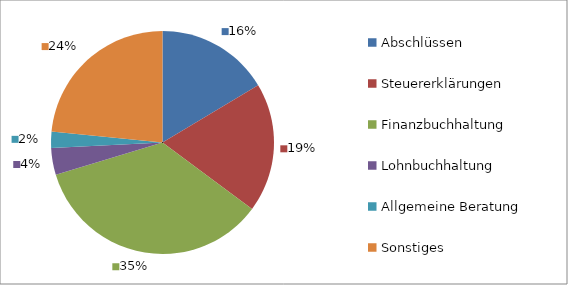
| Category | Series 0 |
|---|---|
| Abschlüssen | 21 |
| Steuererklärungen | 24 |
| Finanzbuchhaltung | 45 |
| Lohnbuchhaltung | 5 |
| Allgemeine Beratung | 3 |
| Sonstiges | 30 |